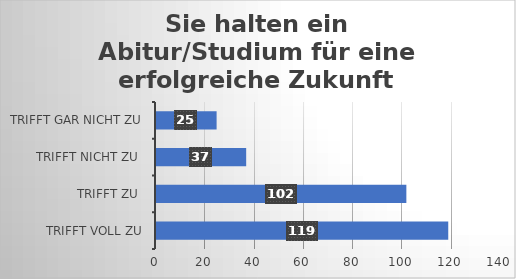
| Category | Sie halten ein Abitur/Studium für eine erfolgreiche Zukunft sinnvoll. |
|---|---|
| trifft voll zu | 119 |
| trifft zu  | 102 |
| trifft nicht zu  | 37 |
| trifft gar nicht zu | 25 |